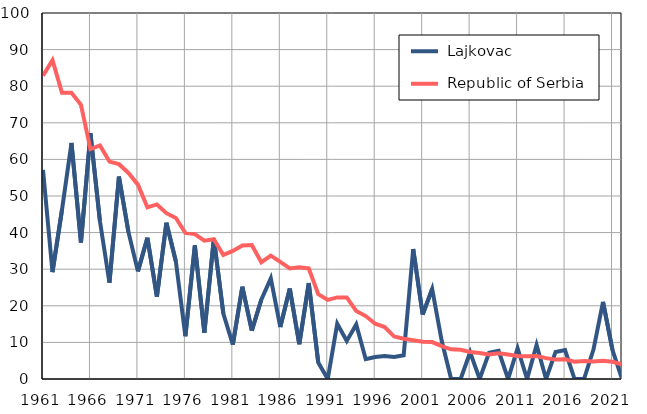
| Category |  Lajkovac |  Republic of Serbia |
|---|---|---|
| 1961.0 | 57.1 | 82.9 |
| 1962.0 | 29.2 | 87.1 |
| 1963.0 | 46.2 | 78.2 |
| 1964.0 | 64.5 | 78.2 |
| 1965.0 | 37.3 | 74.9 |
| 1966.0 | 67.1 | 62.8 |
| 1967.0 | 43.1 | 63.8 |
| 1968.0 | 26.3 | 59.4 |
| 1969.0 | 55.3 | 58.7 |
| 1970.0 | 40.2 | 56.3 |
| 1971.0 | 29.4 | 53.1 |
| 1972.0 | 38.6 | 46.9 |
| 1973.0 | 22.5 | 47.7 |
| 1974.0 | 42.7 | 45.3 |
| 1975.0 | 32.1 | 44 |
| 1976.0 | 11.7 | 39.9 |
| 1977.0 | 36.5 | 39.6 |
| 1978.0 | 12.6 | 37.8 |
| 1979.0 | 38.3 | 38.2 |
| 1980.0 | 17.9 | 33.9 |
| 1981.0 | 9.4 | 35 |
| 1982.0 | 25.2 | 36.5 |
| 1983.0 | 13.2 | 36.6 |
| 1984.0 | 21.7 | 31.9 |
| 1985.0 | 27.5 | 33.7 |
| 1986.0 | 14.2 | 32 |
| 1987.0 | 24.7 | 30.2 |
| 1988.0 | 9.5 | 30.5 |
| 1989.0 | 26.2 | 30.2 |
| 1990.0 | 4.5 | 23.2 |
| 1991.0 | 0 | 21.6 |
| 1992.0 | 15.1 | 22.3 |
| 1993.0 | 10.4 | 22.3 |
| 1994.0 | 14.9 | 18.6 |
| 1995.0 | 5.4 | 17.2 |
| 1996.0 | 6 | 15.1 |
| 1997.0 | 6.3 | 14.2 |
| 1998.0 | 6 | 11.6 |
| 1999.0 | 6.5 | 11 |
| 2000.0 | 35.5 | 10.6 |
| 2001.0 | 17.6 | 10.2 |
| 2002.0 | 24.6 | 10.1 |
| 2003.0 | 10.5 | 9 |
| 2004.0 | 0 | 8.1 |
| 2005.0 | 0 | 8 |
| 2006.0 | 7.3 | 7.4 |
| 2007.0 | 0 | 7.1 |
| 2008.0 | 7.2 | 6.7 |
| 2009.0 | 7.7 | 7 |
| 2010.0 | 0 | 6.7 |
| 2011.0 | 8.4 | 6.3 |
| 2012.0 | 0 | 6.2 |
| 2013.0 | 9.3 | 6.3 |
| 2014.0 | 0 | 5.7 |
| 2015.0 | 7.4 | 5.3 |
| 2016.0 | 7.9 | 5.4 |
| 2017.0 | 0 | 4.7 |
| 2018.0 | 0 | 4.9 |
| 2019.0 | 8.1 | 4.8 |
| 2020.0 | 21.1 | 5 |
| 2021.0 | 7.9 | 4.7 |
| 2022.0 | 0 | 4 |